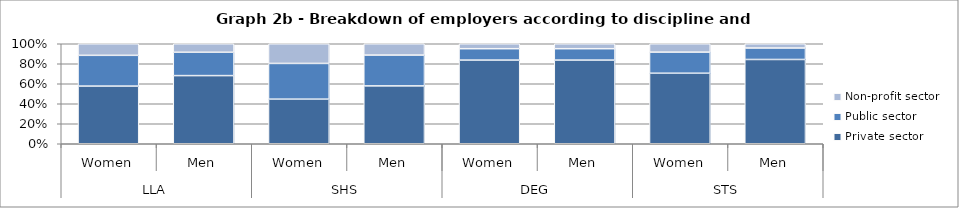
| Category | Private sector | Public sector | Non-profit sector |
|---|---|---|---|
| 0 | 57.66 | 30.75 | 11.57 |
| 1 | 68.15 | 23.36 | 8.49 |
| 2 | 44.59 | 35.74 | 19.66 |
| 3 | 57.86 | 30.83 | 11.32 |
| 4 | 83.66 | 11.39 | 4.95 |
| 5 | 83.66 | 11.39 | 4.95 |
| 6 | 70.53 | 21.11 | 8.37 |
| 7 | 84.27 | 11.48 | 4.25 |